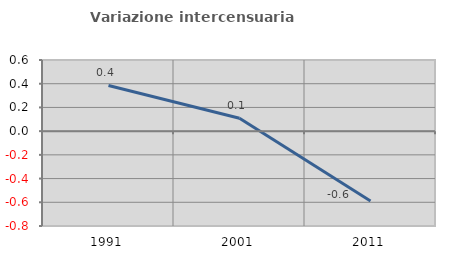
| Category | Variazione intercensuaria annua |
|---|---|
| 1991.0 | 0.385 |
| 2001.0 | 0.108 |
| 2011.0 | -0.589 |